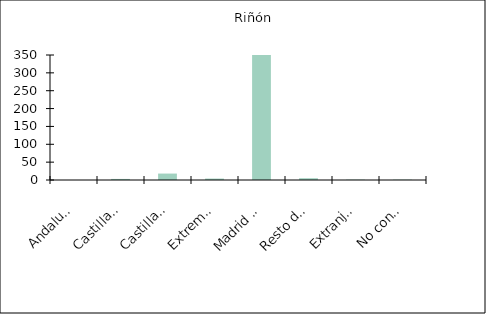
| Category | Riñón |
|---|---|
|    Andalucía | 0 |
|    Castilla y León | 3 |
|    Castilla-La Mancha | 18 |
|    Extremadura | 4 |
|    Madrid (Comunidad de) | 407 |
|    Resto de CCAA | 5 |
|    Extranjero | 1 |
|    No consta | 1 |